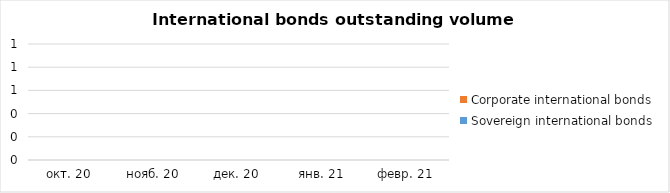
| Category | Sovereign international bonds | Corporate international bonds |
|---|---|---|
| 2020-10-31 | 0 | 0 |
| 2020-11-30 | 0 | 0 |
| 2020-11-30 | 0 | 0 |
| 2020-12-31 | 0 | 0 |
| 2021-01-31 | 0 | 0 |
| 2021-02-28 | 0 | 0 |